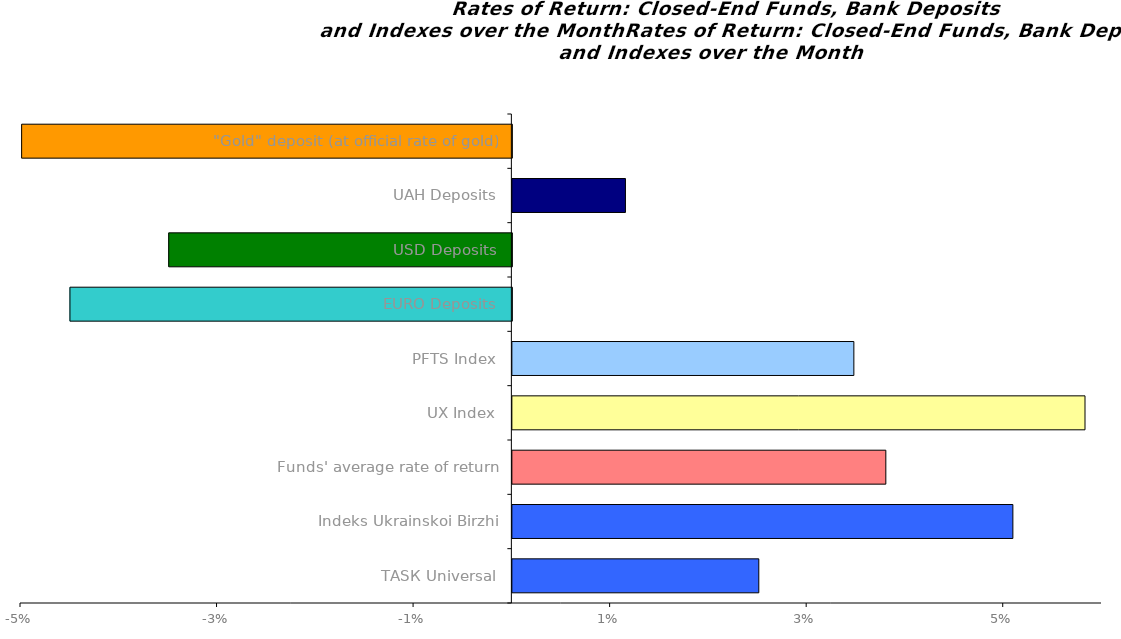
| Category | Series 0 |
|---|---|
| ТАSК Universal | 0.025 |
| Іndeks Ukrainskoi Birzhi | 0.051 |
| Funds' average rate of return | 0.038 |
| UX Index | 0.058 |
| PFTS Index | 0.035 |
| EURO Deposits | -0.045 |
| USD Deposits | -0.035 |
| UAH Deposits | 0.012 |
| "Gold" deposit (at official rate of gold) | -0.05 |